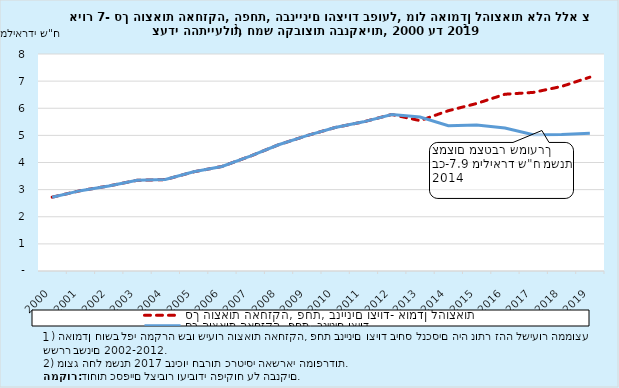
| Category | סך הוצאות האחזקה, פחת, בניינים וציוד- אומדן להוצאות | סך הוצאות האחזקה, פחת, בניינים וציוד |
|---|---|---|
| 2000-12-31 | 2.722 | 2.722 |
| 2001-12-31 | 2.962 | 2.962 |
| 2002-12-31 | 3.136 | 3.136 |
| 2003-12-31 | 3.343 | 3.343 |
| 2004-12-31 | 3.371 | 3.371 |
| 2005-12-31 | 3.656 | 3.656 |
| 2006-12-31 | 3.854 | 3.854 |
| 2007-12-31 | 4.233 | 4.233 |
| 2008-12-31 | 4.654 | 4.654 |
| 2009-12-31 | 4.99 | 4.99 |
| 2010-12-31 | 5.29 | 5.29 |
| 2011-12-31 | 5.499 | 5.499 |
| 2012-12-31 | 5.77 | 5.77 |
| 2013-12-31 | 5.544 | 5.675 |
| 2014-12-31 | 5.909 | 5.358 |
| 2015-12-31 | 6.175 | 5.379 |
| 2016-12-31 | 6.516 | 5.27 |
| 2017-12-31 | 6.584 | 5.024 |
| 2018-12-31 | 6.803 | 5.033 |
| 2019-12-31 | 7.146 | 5.076 |